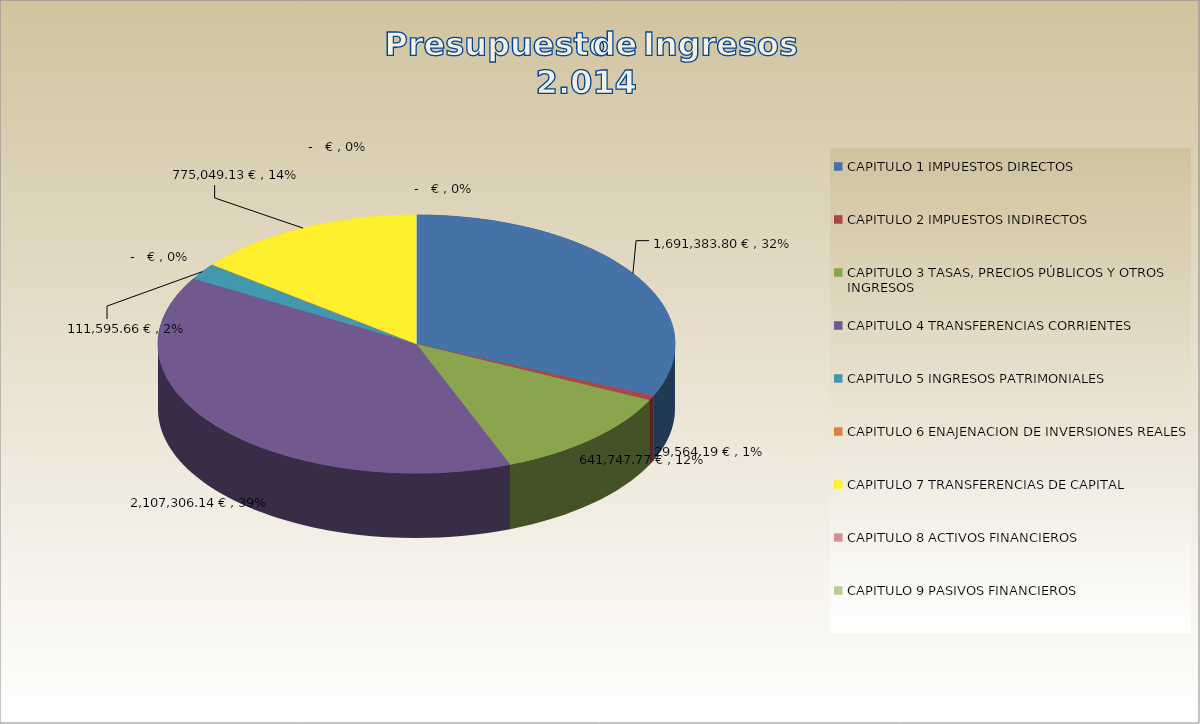
| Category | Series 0 |
|---|---|
| 0 | 1691383.8 |
| 1 | 29564.19 |
| 2 | 641747.77 |
| 3 | 2107306.14 |
| 4 | 111595.66 |
| 5 | 0 |
| 6 | 775049.13 |
| 7 | 0 |
| 8 | 0 |